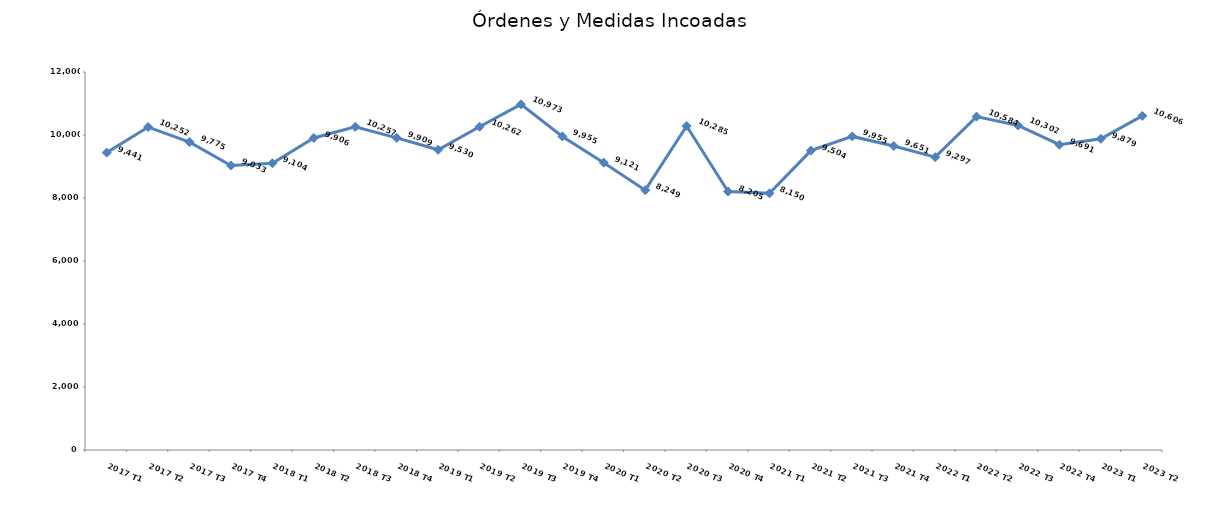
| Category | Órdenes y Medidas incoadas |
|---|---|
| 2017 T1 | 9441 |
| 2017 T2 | 10252 |
| 2017 T3 | 9775 |
| 2017 T4 | 9033 |
| 2018 T1 | 9104 |
| 2018 T2 | 9906 |
| 2018 T3 | 10257 |
| 2018 T4 | 9909 |
| 2019 T1 | 9530 |
| 2019 T2 | 10262 |
| 2019 T3 | 10973 |
| 2019 T4 | 9955 |
| 2020 T1 | 9121 |
| 2020 T2 | 8249 |
| 2020 T3 | 10285 |
| 2020 T4 | 8205 |
| 2021 T1 | 8150 |
| 2021 T2 | 9504 |
| 2021 T3 | 9955 |
| 2021 T4 | 9651 |
| 2022 T1 | 9297 |
| 2022 T2 | 10584 |
| 2022 T3 | 10302 |
| 2022 T4 | 9691 |
| 2023 T1 | 9879 |
| 2023 T2 | 10606 |